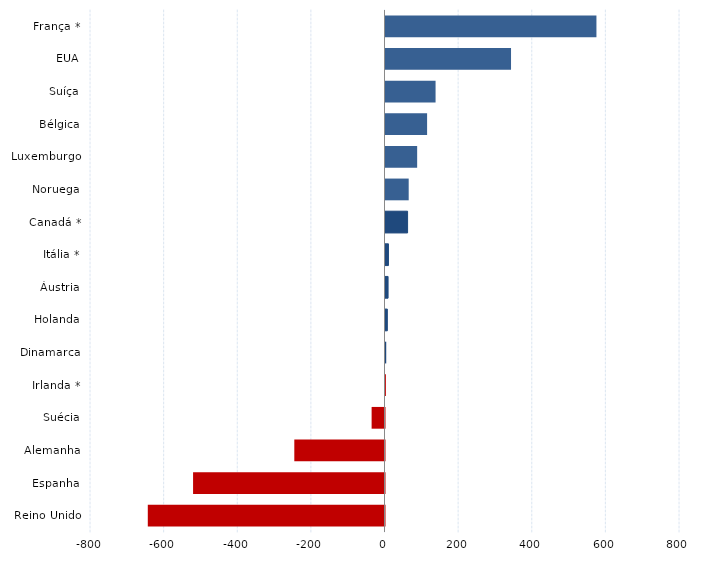
| Category | Series 0 |
|---|---|
| Reino Unido | -643 |
| Espanha | -520 |
| Alemanha | -245 |
| Suécia | -35 |
| Irlanda * | 1 |
| Dinamarca | 2 |
| Holanda | 5 |
| Áustria | 7 |
| Itália * | 8 |
| Canadá * | 60 |
| Noruega | 63 |
| Luxemburgo | 86 |
| Bélgica | 113 |
| Suíça | 136 |
| EUA | 341 |
| França * | 573 |